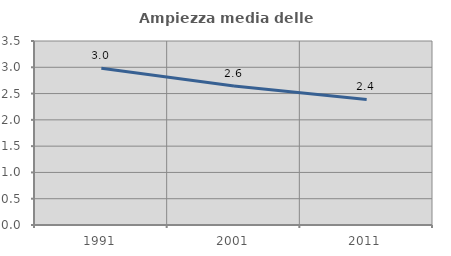
| Category | Ampiezza media delle famiglie |
|---|---|
| 1991.0 | 2.982 |
| 2001.0 | 2.643 |
| 2011.0 | 2.388 |